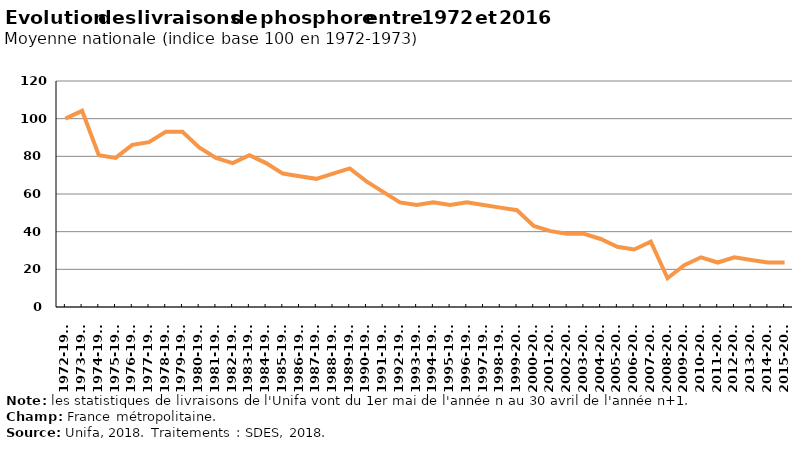
| Category | Phosphore (P) |
|---|---|
| 1972-1973 | 100 |
| 1973-1974 | 104.167 |
| 1974-1975 | 80.556 |
| 1975-1976 | 79.167 |
| 1976-1977 | 86.111 |
| 1977-1978 | 87.5 |
| 1978-1979 | 93.056 |
| 1979-1980 | 93.056 |
| 1980-1981 | 84.722 |
| 1981-1982 | 79.167 |
| 1982-1983 | 76.389 |
| 1983-1984 | 80.556 |
| 1984-1985 | 76.389 |
| 1985-1986 | 70.833 |
| 1986-1987 | 69.444 |
| 1987-1988 | 68.056 |
| 1988-1989 | 70.833 |
| 1989-1990 | 73.611 |
| 1990-1991 | 66.667 |
| 1991-1992 | 61.111 |
| 1992-1993 | 55.556 |
| 1993-1994 | 54.167 |
| 1994-1995 | 55.556 |
| 1995-1996 | 54.167 |
| 1996-1997 | 55.556 |
| 1997-1998 | 54.167 |
| 1998-1999 | 52.778 |
| 1999-2000 | 51.389 |
| 2000-2001 | 43.056 |
| 2001-2002 | 40.278 |
| 2002-2003 | 38.889 |
| 2003-2004 | 38.889 |
| 2004-2005 | 36.111 |
| 2005-2006 | 31.944 |
| 2006-2007 | 30.556 |
| 2007-2008 | 34.722 |
| 2008-2009 | 15.278 |
| 2009-2010 | 22.222 |
| 2010-2011 | 26.389 |
| 2011-2012 | 23.611 |
| 2012-2013 | 26.389 |
| 2013-2014 | 25 |
| 2014-2015 | 23.611 |
| 2015-2016 | 23.611 |